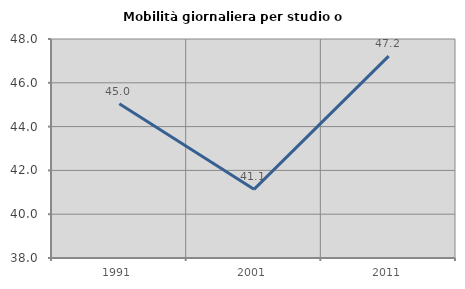
| Category | Mobilità giornaliera per studio o lavoro |
|---|---|
| 1991.0 | 45.045 |
| 2001.0 | 41.135 |
| 2011.0 | 47.217 |